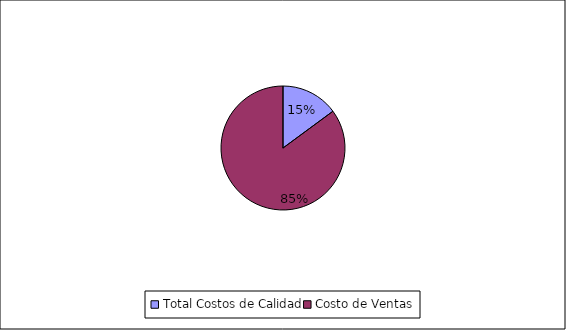
| Category | Series 0 |
|---|---|
| Total Costos de Calidad | 1050529 |
| Costo de Ventas | 6000000 |